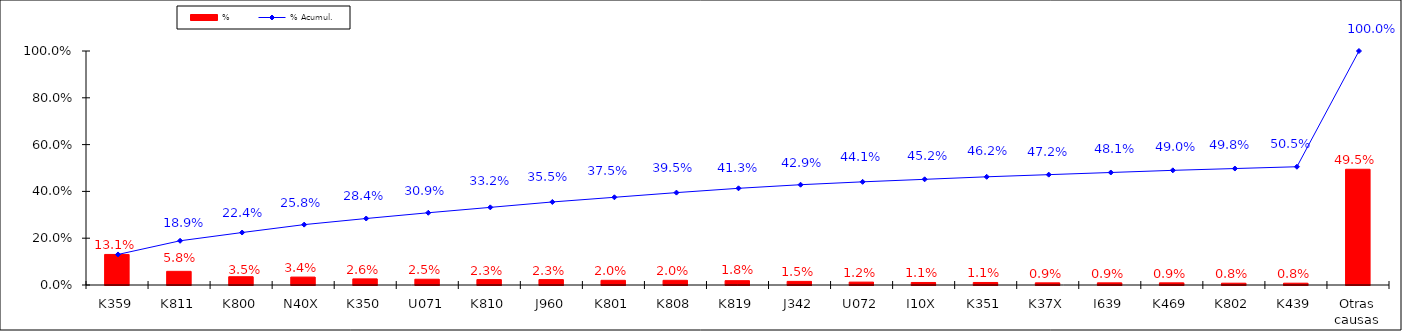
| Category | % |
|---|---|
| K359 | 0.131 |
| K811 | 0.058 |
| K800 | 0.035 |
| N40X | 0.034 |
| K350 | 0.026 |
| U071 | 0.025 |
| K810 | 0.023 |
| J960 | 0.023 |
| K801 | 0.02 |
| K808 | 0.02 |
| K819 | 0.018 |
| J342 | 0.015 |
| U072 | 0.012 |
| I10X | 0.011 |
| K351 | 0.011 |
| K37X | 0.009 |
| I639 | 0.009 |
| K469 | 0.009 |
| K802 | 0.008 |
| K439 | 0.008 |
| Otras causas | 0.495 |